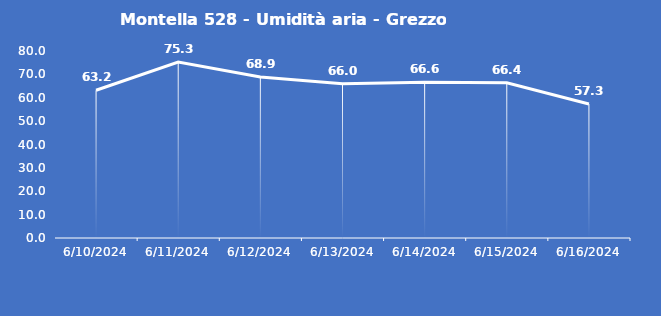
| Category | Montella 528 - Umidità aria - Grezzo (%) |
|---|---|
| 6/10/24 | 63.2 |
| 6/11/24 | 75.3 |
| 6/12/24 | 68.9 |
| 6/13/24 | 66 |
| 6/14/24 | 66.6 |
| 6/15/24 | 66.4 |
| 6/16/24 | 57.3 |